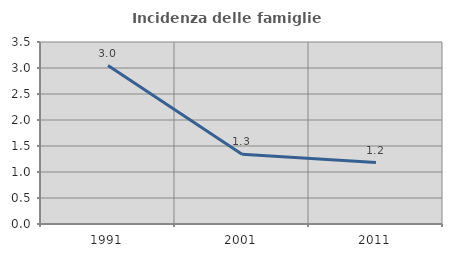
| Category | Incidenza delle famiglie numerose |
|---|---|
| 1991.0 | 3.047 |
| 2001.0 | 1.34 |
| 2011.0 | 1.182 |